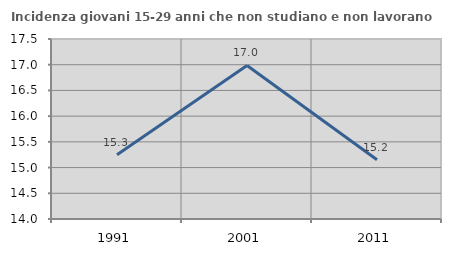
| Category | Incidenza giovani 15-29 anni che non studiano e non lavorano  |
|---|---|
| 1991.0 | 15.251 |
| 2001.0 | 16.985 |
| 2011.0 | 15.152 |